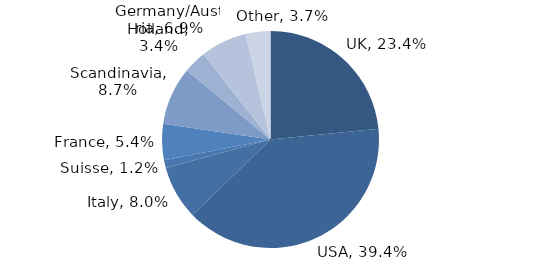
| Category | Investment Style |
|---|---|
| UK | 0.234 |
| USA | 0.394 |
| Italy | 0.08 |
| Suisse | 0.012 |
| France | 0.054 |
| Scandinavia | 0.087 |
| Holland | 0.034 |
| Germany/Austria | 0.069 |
| Other | 0.037 |